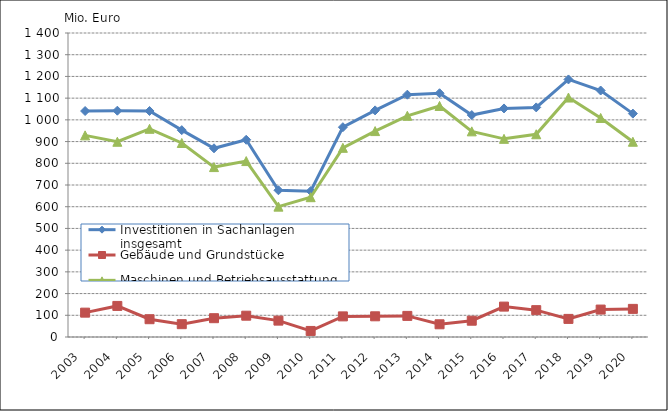
| Category | Investitionen in Sachanlagen insgesamt | Gebäude und Grundstücke | Maschinen und Betriebsausstattung |
|---|---|---|---|
| 2003.0 | 1040673 | 112131 | 928542 |
| 2004.0 | 1042199 | 143093 | 899107 |
| 2005.0 | 1040771 | 81943 | 958828 |
| 2006.0 | 952585 | 59050 | 893535 |
| 2007.0 | 869086 | 86618 | 782467 |
| 2008.0 | 908294 | 98112 | 810182 |
| 2009.0 | 675811 | 75418 | 600393 |
| 2010.0 | 671734.109 | 27895.396 | 643838.713 |
| 2011.0 | 966215.121 | 94979.882 | 871235.239 |
| 2012.0 | 1043637.405 | 95334.066 | 948303.339 |
| 2013.0 | 1115956.006 | 97198.2 | 1018757.806 |
| 2014.0 | 1122553.349 | 58554.558 | 1063998.791 |
| 2015.0 | 1022095.197 | 75014.669 | 947080.528 |
| 2016.0 | 1052570.21 | 139988.972 | 912581.238 |
| 2017.0 | 1057379.348 | 123665.469 | 933713.879 |
| 2018.0 | 1186108.837 | 83370.127 | 1102738.71 |
| 2019.0 | 1135086.868 | 126326.509 | 1008760.359 |
| 2020.0 | 1028738.464 | 129512.226 | 899226.238 |